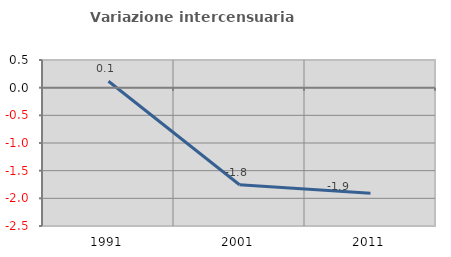
| Category | Variazione intercensuaria annua |
|---|---|
| 1991.0 | 0.117 |
| 2001.0 | -1.754 |
| 2011.0 | -1.907 |